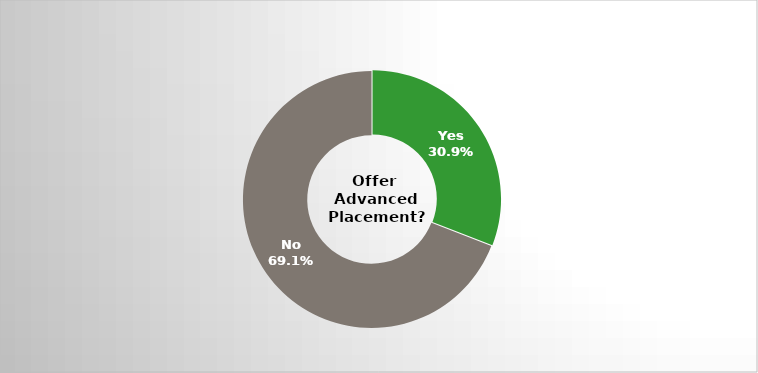
| Category | Series 0 |
|---|---|
| Yes | 0.309 |
| No | 0.691 |